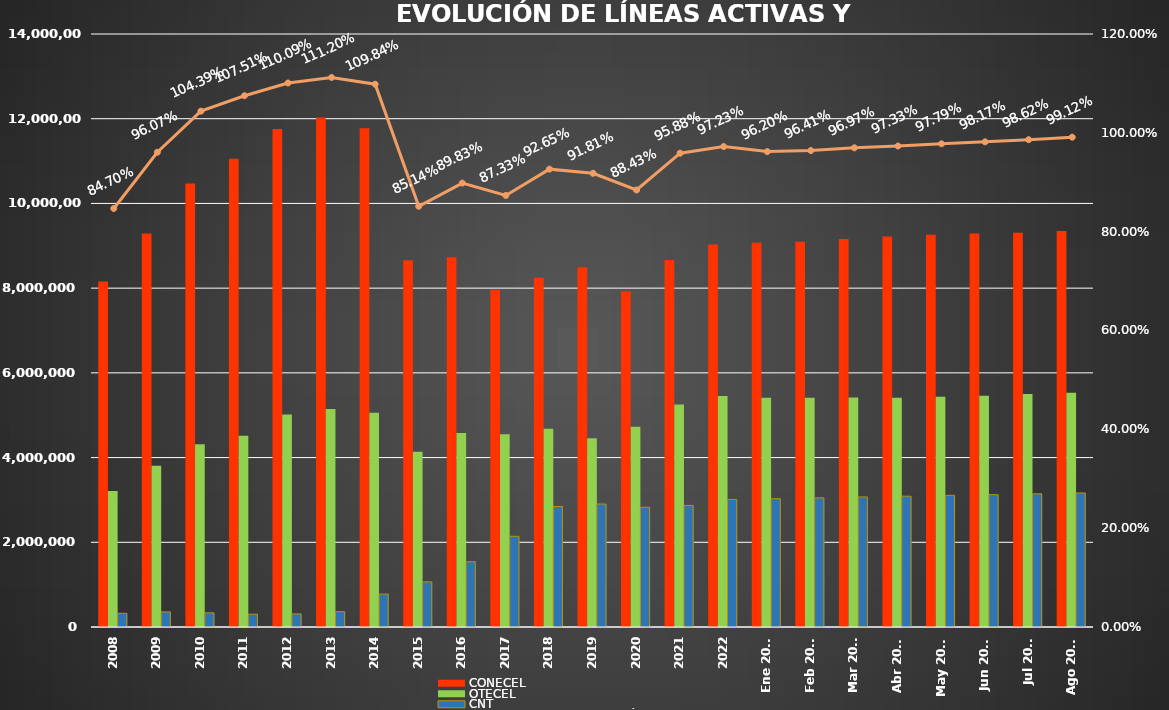
| Category | CONECEL | OTECEL | CNT |
|---|---|---|---|
| 2008 | 8156359 | 3211922 | 323967 |
| 2009 | 9291268 | 3806432 | 356900 |
| 2010 | 10470502 | 4314599 | 333730 |
| 2011 | 11057316 | 4513874 | 303368 |
| 2012 | 11757906 | 5019686 | 309271 |
| 2013 | 12030886 | 5148308 | 362560 |
| 2014 | 11772020 | 5055645 | 776892 |
| 2015 | 8658619 | 4134698 | 1065703 |
| 2016 | 8726823 | 4580092 | 1541219 |
| 2017 | 7960263 | 4549024 | 2142117 |
| 2018 | 8248050 | 4679646 | 2845142 |
| 2019 | 8493054 | 4456356 | 2903690 |
| 2020 | 7929253 | 4729725 | 2826388 |
| 2021 | 8665715 | 5254468 | 2869417 |
| 2022 | 9027737 | 5451115 | 3011899 |
| Ene 2023 | 9073421 | 5411860 | 3028254 |
| Feb 2023 | 9092490 | 5410682 | 3048837 |
| Mar 2023 | 9162562 | 5419670 | 3070611 |
| Abr 2023 | 9220042 | 5409581 | 3089410 |
| May 2023 | 9259499 | 5434175 | 3108405 |
| Jun 2023 | 9290231 | 5458655 | 3123905 |
| Jul 2023 | 9310350 | 5499232 | 3144067 |
| Ago 2023 | 9349530 | 5530451 | 3164614 |